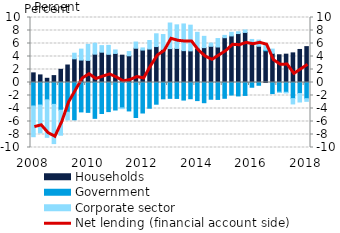
| Category | Households | Government | Corporate sector |
|---|---|---|---|
| 2008.0 | 1.482 | -3.614 | -4.726 |
| 2008.0 | 1.167 | -3.465 | -4.286 |
| 2008.0 | 0.647 | -2.667 | -5.769 |
| 2008.0 | 1.06 | -3.365 | -6.035 |
| 2009.0 | 2.022 | -4.26 | -3.85 |
| 2009.0 | 2.69 | -4.568 | -1.185 |
| 2009.0 | 3.646 | -5.737 | 0.861 |
| 2009.0 | 3.452 | -4.523 | 1.684 |
| 2010.0 | 3.403 | -4.596 | 2.463 |
| 2010.0 | 4.357 | -5.515 | 1.688 |
| 2010.0 | 4.662 | -4.769 | 1.012 |
| 2010.0 | 4.334 | -4.478 | 1.381 |
| 2011.0 | 4.471 | -4.232 | 0.537 |
| 2011.0 | 4.204 | -3.914 | -0.111 |
| 2011.0 | 4.109 | -4.378 | 0.654 |
| 2011.0 | 5.273 | -5.386 | 0.951 |
| 2012.0 | 4.99 | -4.694 | 0.332 |
| 2012.0 | 5.147 | -3.959 | 1.313 |
| 2012.0 | 5.529 | -3.339 | 1.965 |
| 2012.0 | 5.095 | -2.511 | 2.283 |
| 2013.0 | 5.217 | -2.438 | 3.935 |
| 2013.0 | 5.243 | -2.452 | 3.629 |
| 2013.0 | 4.902 | -2.704 | 4.105 |
| 2013.0 | 4.863 | -2.499 | 3.957 |
| 2014.0 | 5.255 | -2.784 | 2.466 |
| 2014.0 | 5.362 | -3.109 | 1.739 |
| 2014.0 | 5.569 | -2.575 | 0.494 |
| 2014.0 | 5.462 | -2.602 | 1.299 |
| 2015.0 | 6.893 | -2.428 | 0.355 |
| 2015.0 | 7.166 | -1.927 | 0.557 |
| 2015.0 | 7.531 | -2.068 | 0.277 |
| 2015.0 | 7.706 | -1.99 | 0.375 |
| 2016.0 | 5.925 | -0.73 | 0.696 |
| 2016.0 | 5.579 | -0.424 | 0.949 |
| 2016.0 | 4.874 | 0.125 | 0.814 |
| 2016.0 | 4.481 | -1.706 | 0.658 |
| 2017.0 | 4.266 | -1.493 | -0.041 |
| 2017.0 | 4.358 | -1.502 | -0.109 |
| 2017.0 | 4.558 | -2.48 | -0.819 |
| 2017.0 | 5.083 | -1.691 | -1.312 |
| 2018.0 | 5.52 | -2.488 | -0.413 |